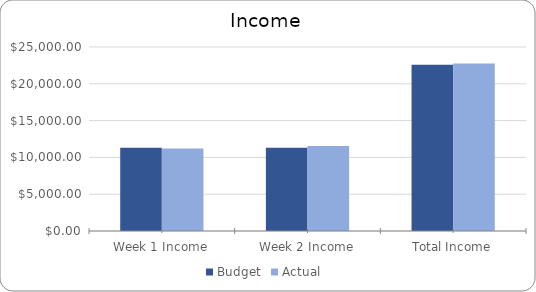
| Category | Budget | Actual  |
|---|---|---|
| Week 1 Income | 11300 | 11200 |
| Week 2 Income | 11300 | 11550 |
| Total Income | 22600 | 22750 |